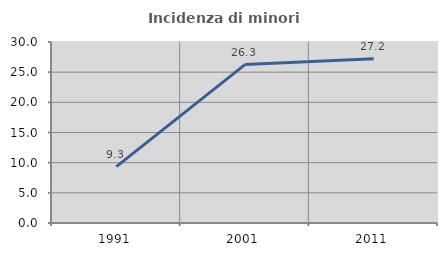
| Category | Incidenza di minori stranieri |
|---|---|
| 1991.0 | 9.341 |
| 2001.0 | 26.261 |
| 2011.0 | 27.231 |